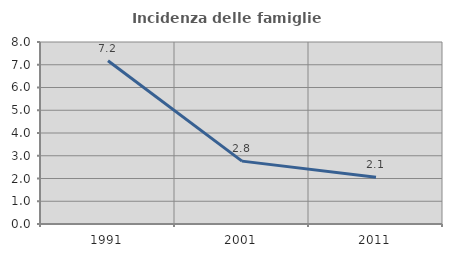
| Category | Incidenza delle famiglie numerose |
|---|---|
| 1991.0 | 7.177 |
| 2001.0 | 2.763 |
| 2011.0 | 2.052 |